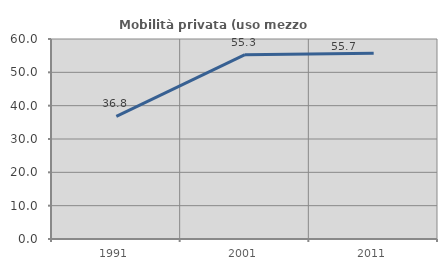
| Category | Mobilità privata (uso mezzo privato) |
|---|---|
| 1991.0 | 36.813 |
| 2001.0 | 55.307 |
| 2011.0 | 55.714 |